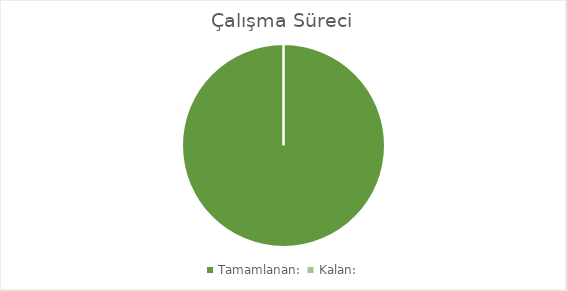
| Category | Series 0 |
|---|---|
| Tamamlanan:  | 5 |
| Kalan: | 0 |